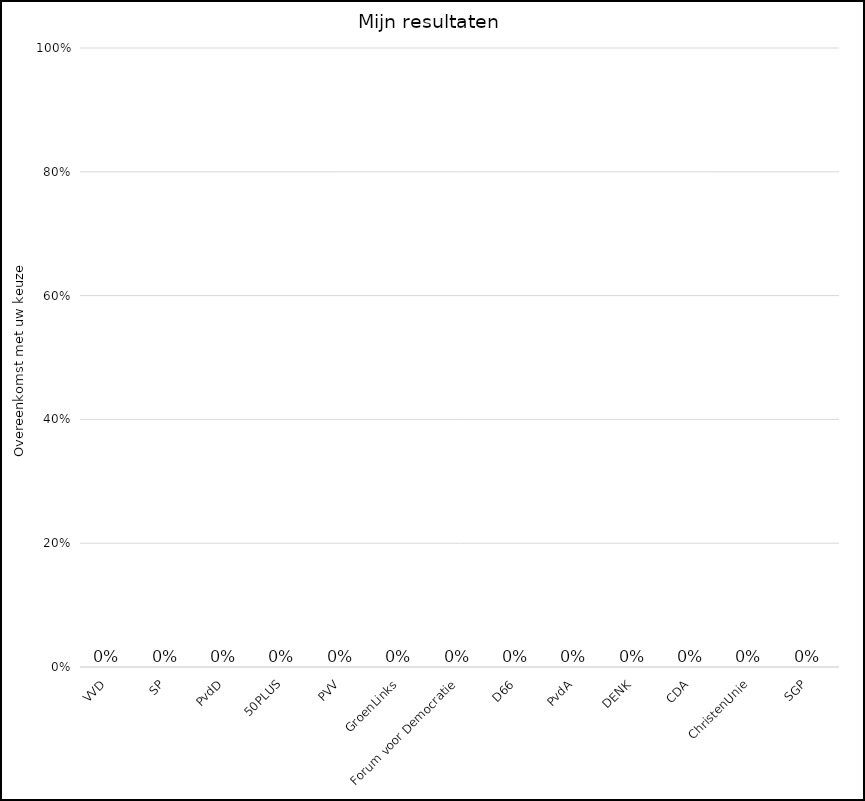
| Category | Overeenkomst met uw keuze |
|---|---|
| VVD | 0 |
| SP | 0 |
| PvdD | 0 |
| 50PLUS | 0 |
| PVV | 0 |
| GroenLinks | 0 |
| Forum voor Democratie | 0 |
| D66 | 0 |
| PvdA | 0 |
| DENK | 0 |
| CDA | 0 |
| ChristenUnie | 0 |
| SGP | 0 |